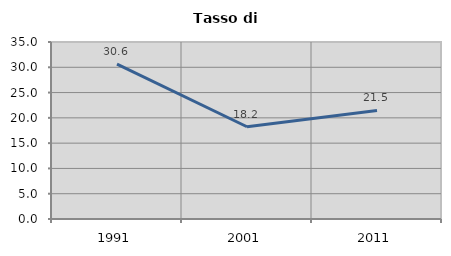
| Category | Tasso di disoccupazione   |
|---|---|
| 1991.0 | 30.619 |
| 2001.0 | 18.243 |
| 2011.0 | 21.466 |